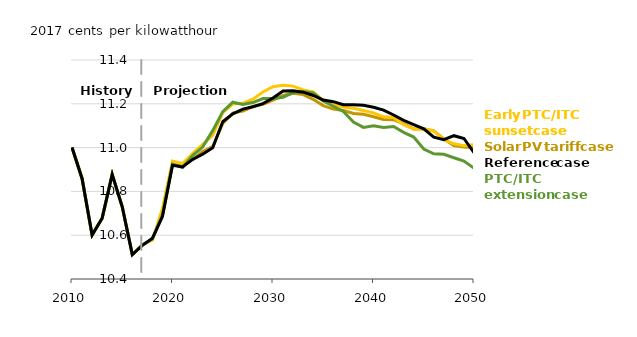
| Category | Solar PV Tariff case | Early PTC/ITC Sunset case | PTC/ITC Extension case | Reference case |
|---|---|---|---|---|
| 2010.0 | 11.001 | 11.001 | 11.001 | 11.001 |
| 2011.0 | 10.859 | 10.859 | 10.859 | 10.859 |
| 2012.0 | 10.601 | 10.601 | 10.601 | 10.601 |
| 2013.0 | 10.678 | 10.678 | 10.678 | 10.678 |
| 2014.0 | 10.877 | 10.877 | 10.877 | 10.877 |
| 2015.0 | 10.73 | 10.73 | 10.73 | 10.73 |
| 2016.0 | 10.512 | 10.512 | 10.512 | 10.512 |
| 2017.0 | 10.556 | 10.556 | 10.556 | 10.554 |
| 2018.0 | 10.583 | 10.577 | 10.583 | 10.586 |
| 2019.0 | 10.691 | 10.722 | 10.695 | 10.685 |
| 2020.0 | 10.922 | 10.939 | 10.925 | 10.92 |
| 2021.0 | 10.917 | 10.927 | 10.909 | 10.912 |
| 2022.0 | 10.945 | 10.973 | 10.963 | 10.946 |
| 2023.0 | 10.982 | 11.015 | 11.002 | 10.97 |
| 2024.0 | 11.004 | 11.056 | 11.077 | 10.999 |
| 2025.0 | 11.11 | 11.159 | 11.164 | 11.118 |
| 2026.0 | 11.158 | 11.199 | 11.207 | 11.154 |
| 2027.0 | 11.167 | 11.202 | 11.197 | 11.176 |
| 2028.0 | 11.187 | 11.221 | 11.206 | 11.187 |
| 2029.0 | 11.197 | 11.254 | 11.224 | 11.201 |
| 2030.0 | 11.216 | 11.278 | 11.224 | 11.226 |
| 2031.0 | 11.238 | 11.285 | 11.23 | 11.258 |
| 2032.0 | 11.248 | 11.281 | 11.251 | 11.259 |
| 2033.0 | 11.242 | 11.264 | 11.256 | 11.253 |
| 2034.0 | 11.221 | 11.255 | 11.249 | 11.238 |
| 2035.0 | 11.192 | 11.214 | 11.213 | 11.217 |
| 2036.0 | 11.176 | 11.196 | 11.189 | 11.21 |
| 2037.0 | 11.169 | 11.185 | 11.165 | 11.196 |
| 2038.0 | 11.156 | 11.179 | 11.117 | 11.196 |
| 2039.0 | 11.152 | 11.169 | 11.092 | 11.193 |
| 2040.0 | 11.141 | 11.159 | 11.1 | 11.184 |
| 2041.0 | 11.129 | 11.141 | 11.092 | 11.171 |
| 2042.0 | 11.127 | 11.137 | 11.096 | 11.149 |
| 2043.0 | 11.108 | 11.105 | 11.07 | 11.124 |
| 2044.0 | 11.085 | 11.084 | 11.048 | 11.105 |
| 2045.0 | 11.086 | 11.086 | 10.994 | 11.086 |
| 2046.0 | 11.077 | 11.075 | 10.971 | 11.047 |
| 2047.0 | 11.039 | 11.036 | 10.97 | 11.036 |
| 2048.0 | 11.01 | 11.017 | 10.954 | 11.054 |
| 2049.0 | 11.003 | 11.009 | 10.939 | 11.042 |
| 2050.0 | 11 | 11.013 | 10.906 | 10.977 |